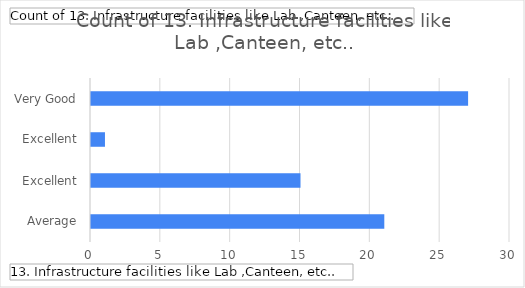
| Category | Total |
|---|---|
| Average | 21 |
| Excellent | 15 |
| Excellent, Very Good | 1 |
| Very Good | 27 |